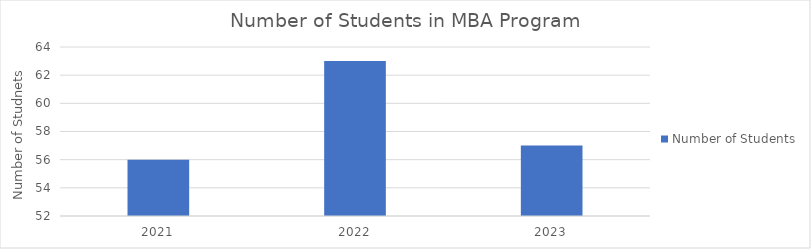
| Category | Number of Students |
|---|---|
| 2021.0 | 56 |
| 2022.0 | 63 |
| 2023.0 | 57 |